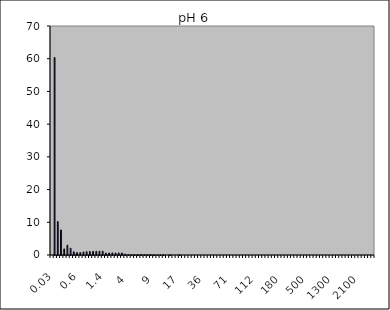
| Category | AH pH 6 1Nb |
|---|---|
| 0.03 | 0 |
| 0.04 | 60.373 |
| 0.07 | 10.229 |
| 0.1 | 7.659 |
| 0.2 | 1.856 |
| 0.3 | 2.991 |
| 0.4 | 2.044 |
| 0.5 | 0.974 |
| 0.6 | 0.722 |
| 0.7 | 0.735 |
| 0.8 | 0.917 |
| 0.9 | 1.014 |
| 1.0 | 1.046 |
| 1.1 | 1.093 |
| 1.2 | 1.126 |
| 1.3 | 1.148 |
| 1.4 | 1.157 |
| 1.6 | 0.573 |
| 1.8 | 0.598 |
| 2.0 | 0.639 |
| 2.2 | 0.611 |
| 2.4 | 0.634 |
| 2.6 | 0.612 |
| 3.0 | 0.278 |
| 4.0 | 0.085 |
| 5.0 | 0.069 |
| 6.0 | 0.05 |
| 6.5 | 0.115 |
| 7.0 | 0.124 |
| 7.5 | 0.089 |
| 8.0 | 0.095 |
| 8.5 | 0.101 |
| 9.0 | 0.054 |
| 10.0 | 0.029 |
| 11.0 | 0.032 |
| 12.0 | 0.035 |
| 13.0 | 0 |
| 14.0 | 0.041 |
| 15.0 | 0 |
| 16.0 | 0 |
| 17.0 | 0.051 |
| 18.0 | 0 |
| 19.0 | 0 |
| 20.0 | 0 |
| 22.0 | 0 |
| 25.0 | 0 |
| 28.0 | 0 |
| 32.0 | 0 |
| 36.0 | 0 |
| 38.0 | 0 |
| 40.0 | 0 |
| 45.0 | 0 |
| 50.0 | 0 |
| 53.0 | 0 |
| 56.0 | 0 |
| 63.0 | 0 |
| 71.0 | 0 |
| 75.0 | 0 |
| 80.0 | 0 |
| 85.0 | 0 |
| 90.0 | 0 |
| 95.0 | 0 |
| 100.0 | 0 |
| 106.0 | 0 |
| 112.0 | 0 |
| 125.0 | 0 |
| 130.0 | 0 |
| 140.0 | 0 |
| 145.0 | 0 |
| 150.0 | 0 |
| 160.0 | 0 |
| 170.0 | 0 |
| 180.0 | 0 |
| 190.0 | 0 |
| 200.0 | 0 |
| 212.0 | 0 |
| 242.0 | 0 |
| 250.0 | 0 |
| 300.0 | 0 |
| 400.0 | 0 |
| 500.0 | 0 |
| 600.0 | 0 |
| 700.0 | 0 |
| 800.0 | 0 |
| 900.0 | 0 |
| 1000.0 | 0 |
| 1100.0 | 0 |
| 1200.0 | 0 |
| 1300.0 | 0 |
| 1400.0 | 0 |
| 1500.0 | 0 |
| 1600.0 | 0 |
| 1700.0 | 0 |
| 1800.0 | 0 |
| 1900.0 | 0 |
| 2000.0 | 0 |
| 2100.0 | 0 |
| 2200.0 | 0 |
| 2300.0 | 0 |
| 2400.0 | 0 |
| 2500.0 | 0 |